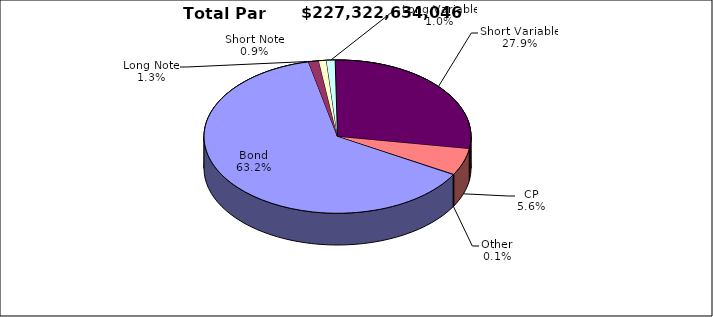
| Category | Par Value |
|---|---|
| Bond | 143596336600 |
| Long Note | 2855030730 |
| Short Note | 2099226377 |
| Long Variable | 2363952131 |
| Short Variable | 63320285388 |
| CP | 12790464000 |
| Other | 297338820 |